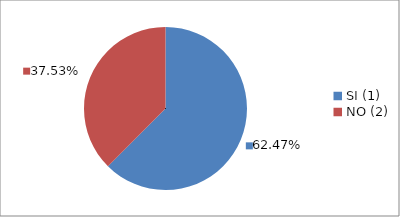
| Category | Series 0 |
|---|---|
| SI (1) | 0.625 |
| NO (2) | 0.375 |